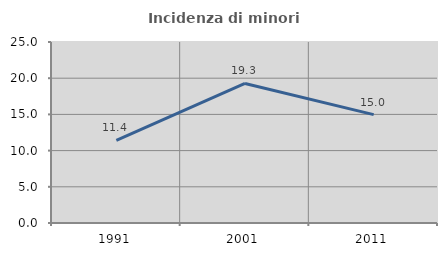
| Category | Incidenza di minori stranieri |
|---|---|
| 1991.0 | 11.429 |
| 2001.0 | 19.277 |
| 2011.0 | 14.966 |